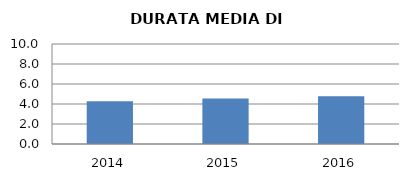
| Category | 2014 2015 2016 |
|---|---|
| 2014.0 | 4.267 |
| 2015.0 | 4.549 |
| 2016.0 | 4.777 |